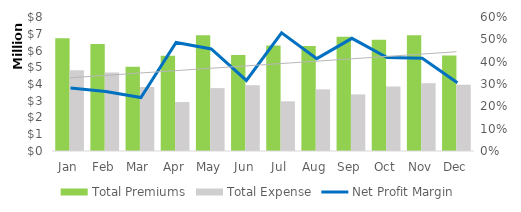
| Category | Total Premiums | Total Expense |
|---|---|---|
| Jan | 6724649 | 4827040 |
| Feb | 6384393 | 4686520 |
| Mar | 5022848 | 3820271 |
| Apr | 5689018 | 2923161 |
| May | 6917081 | 3755598 |
| Jun | 5728622 | 3918782 |
| Jul | 6294791 | 2966114 |
| Aug | 6274570 | 3678955 |
| Sep | 6818758 | 3378702 |
| Oct | 6635161 | 3857811 |
| Nov | 6909085 | 4039470 |
| Dec | 5701042 | 3958245 |